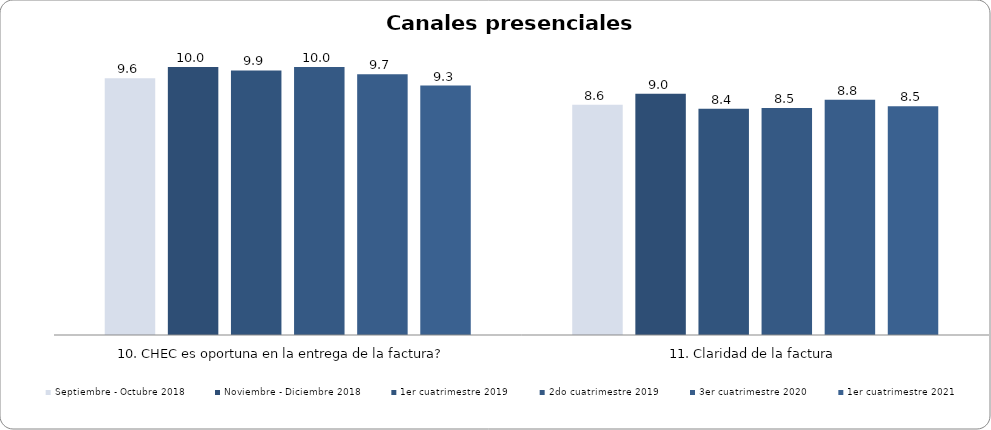
| Category | Septiembre - Octubre 2018 | Noviembre - Diciembre 2018 | 1er cuatrimestre 2019 | 2do cuatrimestre 2019 | 3er cuatrimestre 2020 | 1er cuatrimestre 2021 |
|---|---|---|---|---|---|---|
| 10. CHEC es oportuna en la entrega de la factura? | 9.583 | 10 | 9.872 | 10 | 9.726 | 9.307 |
| 11. Claridad de la factura | 8.591 | 9 | 8.446 | 8.467 | 8.776 | 8.535 |